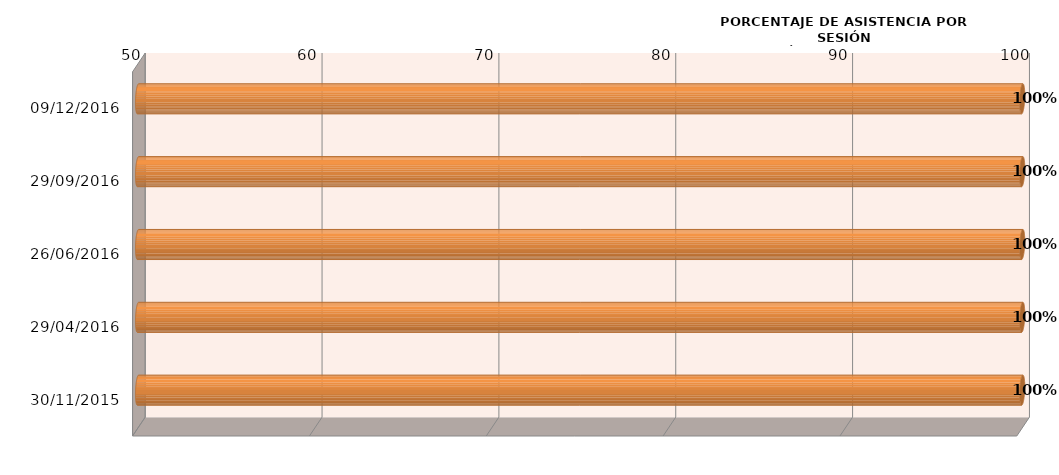
| Category | Series 0 |
|---|---|
| 30/11/2015 | 100 |
| 29/04/2016 | 100 |
| 26/06/2016 | 100 |
| 29/09/2016 | 100 |
| 09/12/2016 | 100 |